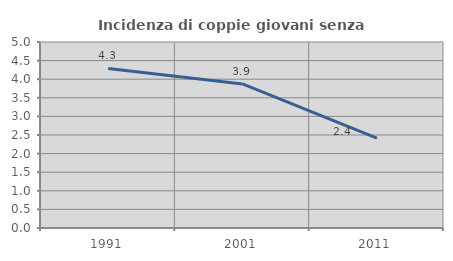
| Category | Incidenza di coppie giovani senza figli |
|---|---|
| 1991.0 | 4.288 |
| 2001.0 | 3.874 |
| 2011.0 | 2.413 |